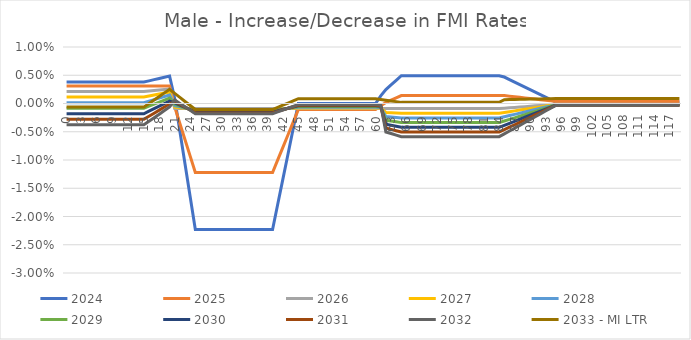
| Category | 2024 | 2025 | 2026 | 2027 | 2028 | 2029 | 2030 | 2031 | 2032 | 2033 - MI LTR |
|---|---|---|---|---|---|---|---|---|---|---|
| 0.0 | 0.004 | 0.003 | 0.002 | 0.001 | 0 | -0.001 | -0.002 | -0.003 | -0.004 | -0.001 |
| 1.0 | 0.004 | 0.003 | 0.002 | 0.001 | 0 | -0.001 | -0.002 | -0.003 | -0.004 | -0.001 |
| 2.0 | 0.004 | 0.003 | 0.002 | 0.001 | 0 | -0.001 | -0.002 | -0.003 | -0.004 | -0.001 |
| 3.0 | 0.004 | 0.003 | 0.002 | 0.001 | 0 | -0.001 | -0.002 | -0.003 | -0.004 | -0.001 |
| 4.0 | 0.004 | 0.003 | 0.002 | 0.001 | 0 | -0.001 | -0.002 | -0.003 | -0.004 | -0.001 |
| 5.0 | 0.004 | 0.003 | 0.002 | 0.001 | 0 | -0.001 | -0.002 | -0.003 | -0.004 | -0.001 |
| 6.0 | 0.004 | 0.003 | 0.002 | 0.001 | 0 | -0.001 | -0.002 | -0.003 | -0.004 | -0.001 |
| 7.0 | 0.004 | 0.003 | 0.002 | 0.001 | 0 | -0.001 | -0.002 | -0.003 | -0.004 | -0.001 |
| 8.0 | 0.004 | 0.003 | 0.002 | 0.001 | 0 | -0.001 | -0.002 | -0.003 | -0.004 | -0.001 |
| 9.0 | 0.004 | 0.003 | 0.002 | 0.001 | 0 | -0.001 | -0.002 | -0.003 | -0.004 | -0.001 |
| 10.0 | 0.004 | 0.003 | 0.002 | 0.001 | 0 | -0.001 | -0.002 | -0.003 | -0.004 | -0.001 |
| 11.0 | 0.004 | 0.003 | 0.002 | 0.001 | 0 | -0.001 | -0.002 | -0.003 | -0.004 | -0.001 |
| 12.0 | 0.004 | 0.003 | 0.002 | 0.001 | 0 | -0.001 | -0.002 | -0.003 | -0.004 | -0.001 |
| 13.0 | 0.004 | 0.003 | 0.002 | 0.001 | 0 | -0.001 | -0.002 | -0.003 | -0.004 | -0.001 |
| 14.0 | 0.004 | 0.003 | 0.002 | 0.001 | 0 | -0.001 | -0.002 | -0.003 | -0.004 | -0.001 |
| 15.0 | 0.004 | 0.003 | 0.002 | 0.001 | 0 | -0.001 | -0.002 | -0.003 | -0.004 | -0.001 |
| 16.0 | 0.004 | 0.003 | 0.002 | 0.001 | 0 | 0 | -0.001 | -0.002 | -0.003 | 0 |
| 17.0 | 0.004 | 0.003 | 0.002 | 0.001 | 0.001 | 0 | -0.001 | -0.002 | -0.003 | 0.001 |
| 18.0 | 0.004 | 0.003 | 0.002 | 0.002 | 0.001 | 0 | 0 | -0.001 | -0.002 | 0.001 |
| 19.0 | 0.005 | 0.003 | 0.002 | 0.002 | 0.001 | 0.001 | 0 | -0.001 | -0.001 | 0.002 |
| 20.0 | 0.005 | 0.003 | 0.003 | 0.002 | 0.002 | 0.001 | 0 | 0 | -0.001 | 0.003 |
| 21.0 | 0.001 | -0.001 | -0.001 | -0.001 | 0 | 0 | 0 | 0 | 0.001 | 0.002 |
| 22.0 | -0.005 | -0.004 | -0.001 | -0.001 | -0.001 | 0 | 0 | 0 | 0 | 0.001 |
| 23.0 | -0.011 | -0.006 | -0.001 | -0.001 | -0.001 | -0.001 | -0.001 | -0.001 | -0.001 | 0 |
| 24.0 | -0.017 | -0.009 | -0.001 | -0.001 | -0.001 | -0.001 | -0.001 | -0.001 | -0.001 | 0 |
| 25.0 | -0.022 | -0.012 | -0.001 | -0.001 | -0.001 | -0.001 | -0.002 | -0.002 | -0.002 | -0.001 |
| 26.0 | -0.022 | -0.012 | -0.001 | -0.001 | -0.001 | -0.001 | -0.002 | -0.002 | -0.002 | -0.001 |
| 27.0 | -0.022 | -0.012 | -0.001 | -0.001 | -0.001 | -0.001 | -0.002 | -0.002 | -0.002 | -0.001 |
| 28.0 | -0.022 | -0.012 | -0.001 | -0.001 | -0.001 | -0.001 | -0.002 | -0.002 | -0.002 | -0.001 |
| 29.0 | -0.022 | -0.012 | -0.001 | -0.001 | -0.001 | -0.001 | -0.002 | -0.002 | -0.002 | -0.001 |
| 30.0 | -0.022 | -0.012 | -0.001 | -0.001 | -0.001 | -0.001 | -0.002 | -0.002 | -0.002 | -0.001 |
| 31.0 | -0.022 | -0.012 | -0.001 | -0.001 | -0.001 | -0.001 | -0.002 | -0.002 | -0.002 | -0.001 |
| 32.0 | -0.022 | -0.012 | -0.001 | -0.001 | -0.001 | -0.001 | -0.002 | -0.002 | -0.002 | -0.001 |
| 33.0 | -0.022 | -0.012 | -0.001 | -0.001 | -0.001 | -0.001 | -0.002 | -0.002 | -0.002 | -0.001 |
| 34.0 | -0.022 | -0.012 | -0.001 | -0.001 | -0.001 | -0.001 | -0.002 | -0.002 | -0.002 | -0.001 |
| 35.0 | -0.022 | -0.012 | -0.001 | -0.001 | -0.001 | -0.001 | -0.002 | -0.002 | -0.002 | -0.001 |
| 36.0 | -0.022 | -0.012 | -0.001 | -0.001 | -0.001 | -0.001 | -0.002 | -0.002 | -0.002 | -0.001 |
| 37.0 | -0.022 | -0.012 | -0.001 | -0.001 | -0.001 | -0.001 | -0.002 | -0.002 | -0.002 | -0.001 |
| 38.0 | -0.022 | -0.012 | -0.001 | -0.001 | -0.001 | -0.001 | -0.002 | -0.002 | -0.002 | -0.001 |
| 39.0 | -0.022 | -0.012 | -0.001 | -0.001 | -0.001 | -0.001 | -0.002 | -0.002 | -0.002 | -0.001 |
| 40.0 | -0.022 | -0.012 | -0.001 | -0.001 | -0.001 | -0.001 | -0.002 | -0.002 | -0.002 | -0.001 |
| 41.0 | -0.018 | -0.01 | -0.001 | -0.001 | -0.001 | -0.001 | -0.001 | -0.001 | -0.001 | -0.001 |
| 42.0 | -0.013 | -0.008 | -0.001 | -0.001 | -0.001 | -0.001 | -0.001 | -0.001 | -0.001 | 0 |
| 43.0 | -0.009 | -0.006 | -0.001 | -0.001 | -0.001 | -0.001 | -0.001 | -0.001 | -0.001 | 0 |
| 44.0 | -0.004 | -0.003 | -0.001 | -0.001 | -0.001 | -0.001 | -0.001 | -0.001 | 0 | 0 |
| 45.0 | 0 | -0.001 | -0.001 | -0.001 | -0.001 | -0.001 | 0 | 0 | 0 | 0.001 |
| 46.0 | 0 | -0.001 | -0.001 | -0.001 | -0.001 | -0.001 | 0 | 0 | 0 | 0.001 |
| 47.0 | 0 | -0.001 | -0.001 | -0.001 | -0.001 | -0.001 | 0 | 0 | 0 | 0.001 |
| 48.0 | 0 | -0.001 | -0.001 | -0.001 | -0.001 | -0.001 | 0 | 0 | 0 | 0.001 |
| 49.0 | 0 | -0.001 | -0.001 | -0.001 | -0.001 | -0.001 | 0 | 0 | 0 | 0.001 |
| 50.0 | 0 | -0.001 | -0.001 | -0.001 | -0.001 | -0.001 | 0 | 0 | 0 | 0.001 |
| 51.0 | 0 | -0.001 | -0.001 | -0.001 | -0.001 | -0.001 | 0 | 0 | 0 | 0.001 |
| 52.0 | 0 | -0.001 | -0.001 | -0.001 | -0.001 | -0.001 | 0 | 0 | 0 | 0.001 |
| 53.0 | 0 | -0.001 | -0.001 | -0.001 | -0.001 | -0.001 | 0 | 0 | 0 | 0.001 |
| 54.0 | 0 | -0.001 | -0.001 | -0.001 | -0.001 | -0.001 | 0 | 0 | 0 | 0.001 |
| 55.0 | 0 | -0.001 | -0.001 | -0.001 | -0.001 | -0.001 | 0 | 0 | 0 | 0.001 |
| 56.0 | 0 | -0.001 | -0.001 | -0.001 | -0.001 | -0.001 | 0 | 0 | 0 | 0.001 |
| 57.0 | 0 | -0.001 | -0.001 | -0.001 | -0.001 | -0.001 | 0 | 0 | 0 | 0.001 |
| 58.0 | 0 | -0.001 | -0.001 | -0.001 | -0.001 | -0.001 | 0 | 0 | 0 | 0.001 |
| 59.0 | 0 | -0.001 | -0.001 | -0.001 | -0.001 | -0.001 | 0 | 0 | 0 | 0.001 |
| 60.0 | 0 | -0.001 | -0.001 | -0.001 | -0.001 | -0.001 | 0 | 0 | 0 | 0.001 |
| 61.0 | 0.001 | 0 | -0.001 | -0.001 | -0.001 | -0.001 | 0 | 0 | 0 | 0.001 |
| 62.0 | 0.002 | 0 | -0.001 | -0.002 | -0.002 | -0.003 | -0.004 | -0.004 | -0.005 | 0.001 |
| 63.0 | 0.003 | 0.001 | -0.001 | -0.002 | -0.002 | -0.003 | -0.004 | -0.005 | -0.005 | 0 |
| 64.0 | 0.004 | 0.001 | -0.001 | -0.002 | -0.002 | -0.003 | -0.004 | -0.005 | -0.006 | 0 |
| 65.0 | 0.005 | 0.001 | -0.001 | -0.002 | -0.003 | -0.003 | -0.004 | -0.005 | -0.006 | 0 |
| 66.0 | 0.005 | 0.001 | -0.001 | -0.002 | -0.003 | -0.003 | -0.004 | -0.005 | -0.006 | 0 |
| 67.0 | 0.005 | 0.001 | -0.001 | -0.002 | -0.003 | -0.003 | -0.004 | -0.005 | -0.006 | 0 |
| 68.0 | 0.005 | 0.001 | -0.001 | -0.002 | -0.003 | -0.003 | -0.004 | -0.005 | -0.006 | 0 |
| 69.0 | 0.005 | 0.001 | -0.001 | -0.002 | -0.003 | -0.003 | -0.004 | -0.005 | -0.006 | 0 |
| 70.0 | 0.005 | 0.001 | -0.001 | -0.002 | -0.003 | -0.003 | -0.004 | -0.005 | -0.006 | 0 |
| 71.0 | 0.005 | 0.001 | -0.001 | -0.002 | -0.003 | -0.003 | -0.004 | -0.005 | -0.006 | 0 |
| 72.0 | 0.005 | 0.001 | -0.001 | -0.002 | -0.003 | -0.003 | -0.004 | -0.005 | -0.006 | 0 |
| 73.0 | 0.005 | 0.001 | -0.001 | -0.002 | -0.003 | -0.003 | -0.004 | -0.005 | -0.006 | 0 |
| 74.0 | 0.005 | 0.001 | -0.001 | -0.002 | -0.003 | -0.003 | -0.004 | -0.005 | -0.006 | 0 |
| 75.0 | 0.005 | 0.001 | -0.001 | -0.002 | -0.003 | -0.003 | -0.004 | -0.005 | -0.006 | 0 |
| 76.0 | 0.005 | 0.001 | -0.001 | -0.002 | -0.003 | -0.003 | -0.004 | -0.005 | -0.006 | 0 |
| 77.0 | 0.005 | 0.001 | -0.001 | -0.002 | -0.003 | -0.003 | -0.004 | -0.005 | -0.006 | 0 |
| 78.0 | 0.005 | 0.001 | -0.001 | -0.002 | -0.003 | -0.003 | -0.004 | -0.005 | -0.006 | 0 |
| 79.0 | 0.005 | 0.001 | -0.001 | -0.002 | -0.003 | -0.003 | -0.004 | -0.005 | -0.006 | 0 |
| 80.0 | 0.005 | 0.001 | -0.001 | -0.002 | -0.003 | -0.003 | -0.004 | -0.005 | -0.006 | 0 |
| 81.0 | 0.005 | 0.001 | -0.001 | -0.002 | -0.003 | -0.003 | -0.004 | -0.005 | -0.006 | 0 |
| 82.0 | 0.005 | 0.001 | -0.001 | -0.002 | -0.003 | -0.003 | -0.004 | -0.005 | -0.006 | 0 |
| 83.0 | 0.005 | 0.001 | -0.001 | -0.002 | -0.003 | -0.003 | -0.004 | -0.005 | -0.006 | 0 |
| 84.0 | 0.005 | 0.001 | -0.001 | -0.002 | -0.003 | -0.003 | -0.004 | -0.005 | -0.006 | 0 |
| 85.0 | 0.005 | 0.001 | -0.001 | -0.002 | -0.002 | -0.003 | -0.004 | -0.005 | -0.005 | 0.001 |
| 86.0 | 0.004 | 0.001 | -0.001 | -0.001 | -0.002 | -0.003 | -0.004 | -0.004 | -0.005 | 0.001 |
| 87.0 | 0.004 | 0.001 | -0.001 | -0.001 | -0.002 | -0.003 | -0.003 | -0.004 | -0.004 | 0.001 |
| 88.0 | 0.003 | 0.001 | -0.001 | -0.001 | -0.002 | -0.002 | -0.003 | -0.003 | -0.004 | 0.001 |
| 89.0 | 0.003 | 0.001 | -0.001 | -0.001 | -0.001 | -0.002 | -0.002 | -0.003 | -0.003 | 0.001 |
| 90.0 | 0.002 | 0.001 | 0 | -0.001 | -0.001 | -0.002 | -0.002 | -0.002 | -0.003 | 0.001 |
| 91.0 | 0.002 | 0.001 | 0 | -0.001 | -0.001 | -0.001 | -0.002 | -0.002 | -0.002 | 0.001 |
| 92.0 | 0.002 | 0.001 | 0 | -0.001 | -0.001 | -0.001 | -0.001 | -0.002 | -0.002 | 0.001 |
| 93.0 | 0.001 | 0.001 | 0 | 0 | -0.001 | -0.001 | -0.001 | -0.001 | -0.001 | 0.001 |
| 94.0 | 0.001 | 0 | 0 | 0 | 0 | -0.001 | -0.001 | -0.001 | -0.001 | 0.001 |
| 95.0 | 0 | 0 | 0 | 0 | 0 | 0 | 0 | 0 | 0 | 0.001 |
| 96.0 | 0 | 0 | 0 | 0 | 0 | 0 | 0 | 0 | 0 | 0.001 |
| 97.0 | 0 | 0 | 0 | 0 | 0 | 0 | 0 | 0 | 0 | 0.001 |
| 98.0 | 0 | 0 | 0 | 0 | 0 | 0 | 0 | 0 | 0 | 0.001 |
| 99.0 | 0 | 0 | 0 | 0 | 0 | 0 | 0 | 0 | 0 | 0.001 |
| 100.0 | 0 | 0 | 0 | 0 | 0 | 0 | 0 | 0 | 0 | 0.001 |
| 101.0 | 0 | 0 | 0 | 0 | 0 | 0 | 0 | 0 | 0 | 0.001 |
| 102.0 | 0 | 0 | 0 | 0 | 0 | 0 | 0 | 0 | 0 | 0.001 |
| 103.0 | 0 | 0 | 0 | 0 | 0 | 0 | 0 | 0 | 0 | 0.001 |
| 104.0 | 0 | 0 | 0 | 0 | 0 | 0 | 0 | 0 | 0 | 0.001 |
| 105.0 | 0 | 0 | 0 | 0 | 0 | 0 | 0 | 0 | 0 | 0.001 |
| 106.0 | 0 | 0 | 0 | 0 | 0 | 0 | 0 | 0 | 0 | 0.001 |
| 107.0 | 0 | 0 | 0 | 0 | 0 | 0 | 0 | 0 | 0 | 0.001 |
| 108.0 | 0 | 0 | 0 | 0 | 0 | 0 | 0 | 0 | 0 | 0.001 |
| 109.0 | 0 | 0 | 0 | 0 | 0 | 0 | 0 | 0 | 0 | 0.001 |
| 110.0 | 0 | 0 | 0 | 0 | 0 | 0 | 0 | 0 | 0 | 0.001 |
| 111.0 | 0 | 0 | 0 | 0 | 0 | 0 | 0 | 0 | 0 | 0.001 |
| 112.0 | 0 | 0 | 0 | 0 | 0 | 0 | 0 | 0 | 0 | 0.001 |
| 113.0 | 0 | 0 | 0 | 0 | 0 | 0 | 0 | 0 | 0 | 0.001 |
| 114.0 | 0 | 0 | 0 | 0 | 0 | 0 | 0 | 0 | 0 | 0.001 |
| 115.0 | 0 | 0 | 0 | 0 | 0 | 0 | 0 | 0 | 0 | 0.001 |
| 116.0 | 0 | 0 | 0 | 0 | 0 | 0 | 0 | 0 | 0 | 0.001 |
| 117.0 | 0 | 0 | 0 | 0 | 0 | 0 | 0 | 0 | 0 | 0.001 |
| 118.0 | 0 | 0 | 0 | 0 | 0 | 0 | 0 | 0 | 0 | 0.001 |
| 119.0 | 0 | 0 | 0 | 0 | 0 | 0 | 0 | 0 | 0 | 0.001 |